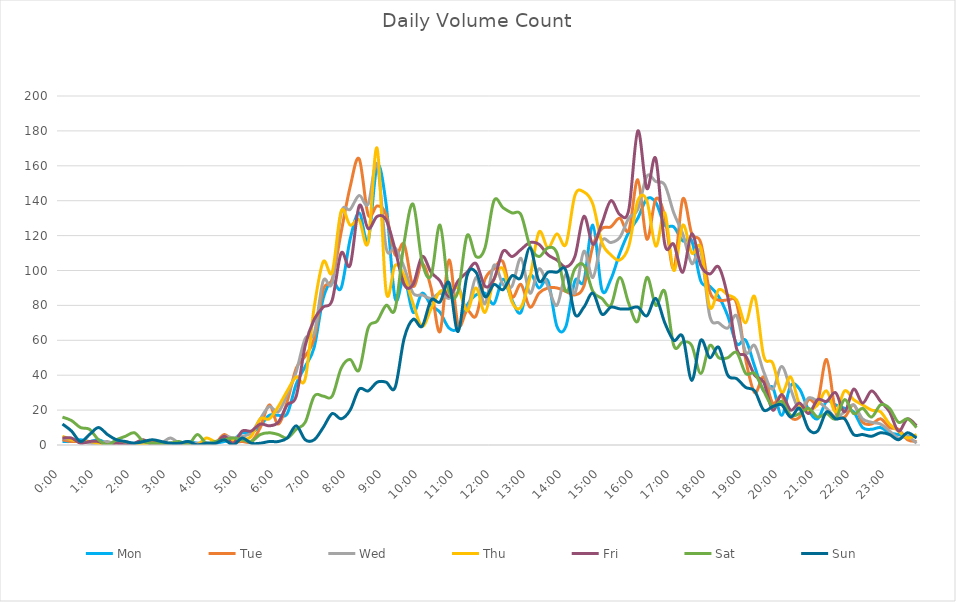
| Category | Mon | Tue | Wed | Thu | Fri | Sat | Sun |
|---|---|---|---|---|---|---|---|
| 0.0 | 2 | 3 | 4 | 5 | 4 | 16 | 12 |
| 0.010416666666666666 | 2 | 2 | 3 | 3 | 4 | 14 | 8 |
| 0.020833333333333332 | 3 | 2 | 2 | 2 | 1 | 10 | 2 |
| 0.03125 | 2 | 2 | 1 | 2 | 2 | 9 | 6 |
| 0.041666666666666664 | 3 | 0 | 1 | 1 | 2 | 3 | 10 |
| 0.05208333333333333 | 1 | 1 | 2 | 0 | 0 | 0 | 6 |
| 0.06249999999999999 | 2 | 1 | 0 | 0 | 1 | 3 | 3 |
| 0.07291666666666666 | 1 | 2 | 0 | 0 | 0 | 5 | 2 |
| 0.08333333333333333 | 1 | 0 | 0 | 0 | 1 | 7 | 1 |
| 0.09375 | 1 | 0 | 0 | 0 | 3 | 2 | 2 |
| 0.10416666666666667 | 1 | 2 | 0 | 1 | 0 | 1 | 3 |
| 0.11458333333333334 | 0 | 0 | 1 | 0 | 0 | 1 | 2 |
| 0.125 | 1 | 0 | 4 | 1 | 1 | 1 | 1 |
| 0.13541666666666666 | 1 | 1 | 1 | 1 | 0 | 2 | 1 |
| 0.14583333333333331 | 2 | 0 | 1 | 0 | 0 | 0 | 2 |
| 0.15624999999999997 | 1 | 0 | 1 | 0 | 0 | 6 | 0 |
| 0.16666666666666663 | 1 | 0 | 1 | 4 | 1 | 1 | 1 |
| 0.1770833333333333 | 1 | 1 | 1 | 2 | 1 | 2 | 1 |
| 0.18749999999999994 | 2 | 6 | 5 | 4 | 5 | 3 | 3 |
| 0.1979166666666666 | 3 | 2 | 4 | 3 | 1 | 4 | 0 |
| 0.20833333333333326 | 7 | 2 | 5 | 3 | 8 | 3 | 4 |
| 0.21874999999999992 | 7 | 2 | 7 | 5 | 8 | 2 | 1 |
| 0.22916666666666657 | 11 | 10 | 15 | 15 | 12 | 6 | 1 |
| 0.23958333333333323 | 17 | 23 | 22 | 15 | 11 | 7 | 2 |
| 0.2499999999999999 | 17 | 12 | 19 | 22 | 13 | 6 | 2 |
| 0.2604166666666666 | 18 | 25 | 29 | 31 | 23 | 4 | 4 |
| 0.27083333333333326 | 35 | 44 | 42 | 39 | 28 | 9 | 11 |
| 0.28124999999999994 | 45 | 51 | 61 | 38 | 57 | 13 | 3 |
| 0.29166666666666663 | 56 | 61 | 64 | 79 | 72 | 28 | 3 |
| 0.3020833333333333 | 84 | 89 | 94 | 105 | 79 | 28 | 10 |
| 0.3125 | 94 | 95 | 93 | 99 | 83 | 28 | 18 |
| 0.3229166666666667 | 90 | 122 | 133 | 134 | 110 | 44 | 15 |
| 0.33333333333333337 | 118 | 148 | 135 | 126 | 103 | 49 | 20 |
| 0.34375000000000006 | 133 | 164 | 143 | 129 | 137 | 43 | 32 |
| 0.35416666666666674 | 117 | 132 | 138 | 116 | 124 | 67 | 31 |
| 0.3645833333333334 | 160 | 137 | 161 | 170 | 131 | 71 | 36 |
| 0.3750000000000001 | 138 | 132 | 113 | 88 | 129 | 80 | 36 |
| 0.3854166666666668 | 84 | 109 | 113 | 103 | 112 | 78 | 33 |
| 0.3958333333333335 | 96 | 115 | 102 | 97 | 92 | 116 | 61 |
| 0.40625000000000017 | 76 | 91 | 87 | 81 | 92 | 138 | 72 |
| 0.41666666666666685 | 87 | 104 | 86 | 68 | 108 | 105 | 68 |
| 0.4270833333333333 | 80 | 90 | 84 | 78 | 99 | 97 | 83 |
| 0.4375000000000002 | 76 | 65 | 87 | 88 | 94 | 126 | 82 |
| 0.4479166666666669 | 67 | 106 | 84 | 88 | 85 | 88 | 93 |
| 0.4583333333333333 | 67 | 69 | 91 | 90 | 94 | 88 | 65 |
| 0.4687500000000003 | 80 | 77 | 78 | 77 | 99 | 120 | 97 |
| 0.47916666666666696 | 86 | 74 | 96 | 90 | 104 | 108 | 99 |
| 0.4895833333333333 | 87 | 95 | 81 | 76 | 91 | 113 | 85 |
| 0.5000000000000003 | 81 | 101 | 103 | 95 | 95 | 140 | 92 |
| 0.510416666666667 | 95 | 105 | 92 | 101 | 111 | 136 | 89 |
| 0.5208333333333334 | 83 | 85 | 91 | 82 | 108 | 133 | 97 |
| 0.5312500000000002 | 76 | 92 | 107 | 79 | 112 | 132 | 96 |
| 0.5416666666666669 | 97 | 79 | 87 | 96 | 116 | 114 | 113 |
| 0.5520833333333335 | 90 | 87 | 101 | 122 | 115 | 108 | 94 |
| 0.5625000000000001 | 94 | 90 | 91 | 113 | 109 | 113 | 99 |
| 0.5729166666666667 | 68 | 90 | 80 | 121 | 106 | 110 | 99 |
| 0.5833333333333334 | 68 | 88 | 98 | 115 | 102 | 88 | 100 |
| 0.59375 | 94 | 86 | 87 | 143 | 108 | 101 | 75 |
| 0.6041666666666666 | 94 | 91 | 111 | 145 | 131 | 103 | 79 |
| 0.6145833333333333 | 126 | 114 | 96 | 138 | 115 | 88 | 87 |
| 0.6249999999999999 | 89 | 124 | 117 | 116 | 127 | 84 | 75 |
| 0.6354166666666665 | 95 | 125 | 116 | 109 | 140 | 80 | 79 |
| 0.6458333333333331 | 110 | 130 | 119 | 106 | 132 | 96 | 78 |
| 0.6562499999999998 | 122 | 123 | 130 | 114 | 135 | 81 | 78 |
| 0.6666666666666666 | 130 | 152 | 135 | 140 | 180 | 71 | 79 |
| 0.677083333333333 | 141 | 118 | 154 | 140 | 147 | 96 | 74 |
| 0.6874999999999997 | 139 | 141 | 151 | 114 | 164 | 80 | 84 |
| 0.6979166666666666 | 126 | 131 | 149 | 133 | 115 | 88 | 70 |
| 0.7083333333333329 | 125 | 101 | 133 | 100 | 115 | 57 | 60 |
| 0.7187499999999996 | 117 | 141 | 121 | 126 | 99 | 59 | 62 |
| 0.7291666666666666 | 117 | 121 | 104 | 110 | 121 | 57 | 37 |
| 0.7395833333333328 | 94 | 116 | 111 | 113 | 103 | 41 | 60 |
| 0.75 | 91 | 88 | 74 | 79 | 98 | 57 | 50 |
| 0.7604166666666666 | 85 | 83 | 70 | 89 | 102 | 50 | 56 |
| 0.7708333333333327 | 74 | 83 | 67 | 86 | 85 | 50 | 40 |
| 0.78125 | 58 | 81 | 74 | 83 | 55 | 53 | 38 |
| 0.7916666666666666 | 60 | 49 | 53 | 70 | 51 | 41 | 33 |
| 0.8020833333333326 | 45 | 30 | 57 | 85 | 40 | 41 | 31 |
| 0.8125 | 31 | 39 | 42 | 51 | 36 | 31 | 20 |
| 0.8229166666666666 | 33 | 24 | 32 | 47 | 20 | 22 | 22 |
| 0.8333333333333334 | 17 | 28 | 45 | 30 | 29 | 25 | 23 |
| 0.84375 | 34 | 16 | 32 | 39 | 20 | 17 | 16 |
| 0.8541666666666666 | 32 | 16 | 20 | 23 | 24 | 18 | 21 |
| 0.8645833333333334 | 20 | 26 | 27 | 20 | 18 | 21 | 9 |
| 0.875 | 15 | 25 | 25 | 23 | 26 | 16 | 8 |
| 0.8854166666666666 | 25 | 49 | 21 | 31 | 25 | 18 | 19 |
| 0.8958333333333334 | 23 | 19 | 16 | 19 | 30 | 15 | 15 |
| 0.90625 | 21 | 16 | 19 | 31 | 19 | 26 | 15 |
| 0.9166666666666666 | 19 | 23 | 23 | 26 | 32 | 18 | 6 |
| 0.9270833333333334 | 10 | 13 | 15 | 23 | 24 | 21 | 6 |
| 0.9375 | 9 | 12 | 13 | 20 | 31 | 16 | 5 |
| 0.9479166666666666 | 10 | 15 | 12 | 19 | 25 | 23 | 7 |
| 0.9583333333333334 | 7 | 10 | 8 | 12 | 19 | 21 | 6 |
| 0.96875 | 6 | 9 | 4 | 8 | 8 | 13 | 3 |
| 0.9791666666666666 | 5 | 3 | 5 | 4 | 15 | 15 | 7 |
| 0.9895833333333334 | 5 | 2 | 1 | 6 | 11 | 10 | 4 |